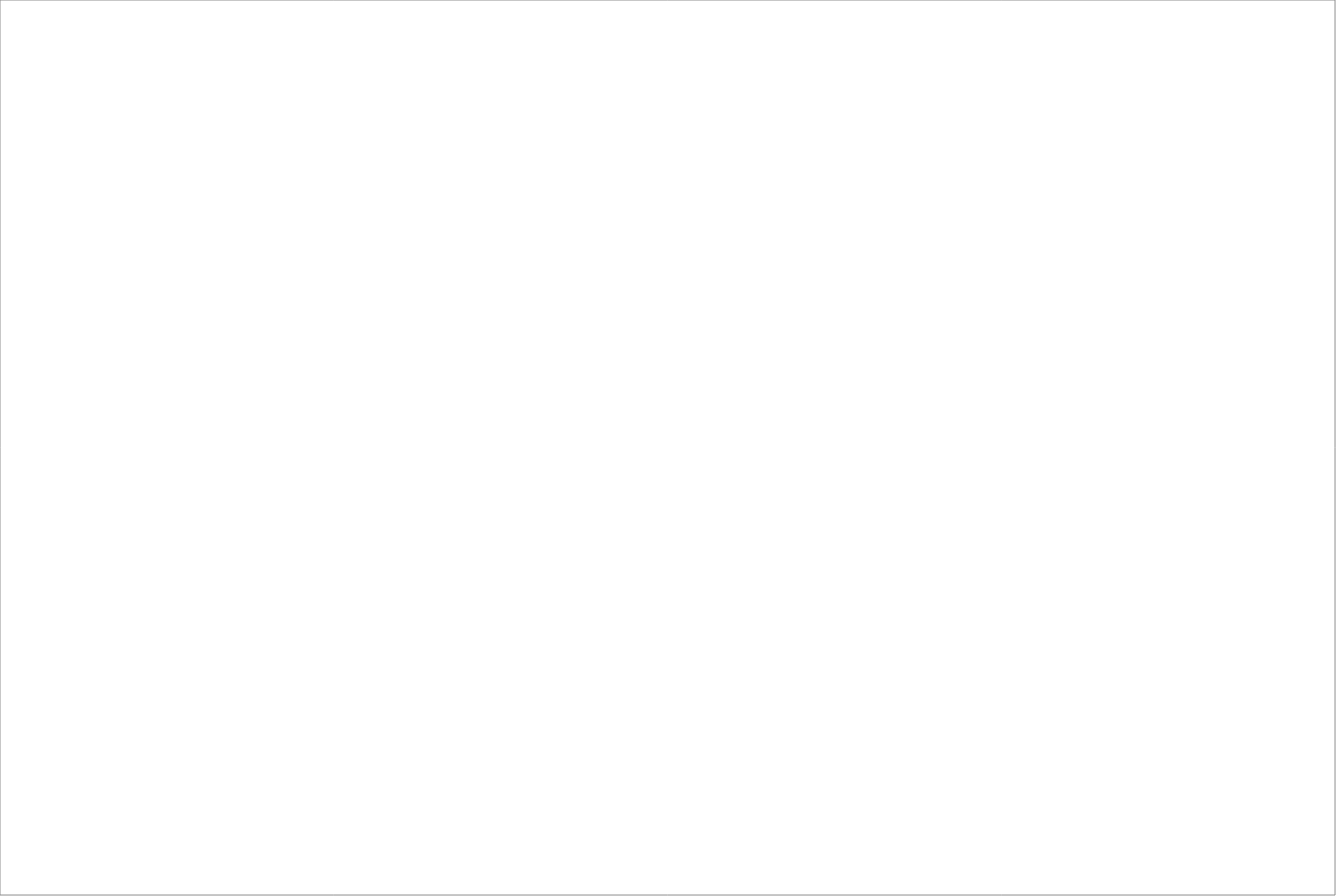
| Category | Total |
|---|---|
| Adecco Sweden Aktiebolag | 70 |
| Experis AB | 66.25 |
| Poolia Sverige Aktiebolag | 65 |
| StudentConsulting Sweden AB | 65 |
| Academic Work Sweden AB | 62.5 |